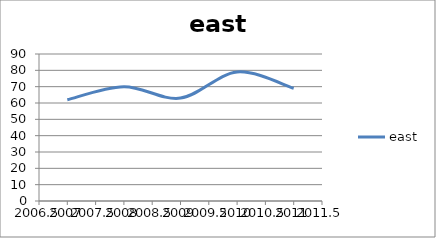
| Category | east |
|---|---|
| 2007.0 | 62 |
| 2008.0 | 70 |
| 2009.0 | 63 |
| 2010.0 | 79 |
| 2011.0 | 69 |